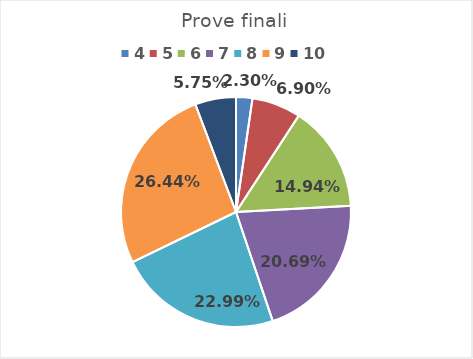
| Category | Series 0 |
|---|---|
| 4.0 | 0.023 |
| 5.0 | 0.069 |
| 6.0 | 0.149 |
| 7.0 | 0.207 |
| 8.0 | 0.23 |
| 9.0 | 0.264 |
| 10.0 | 0.057 |